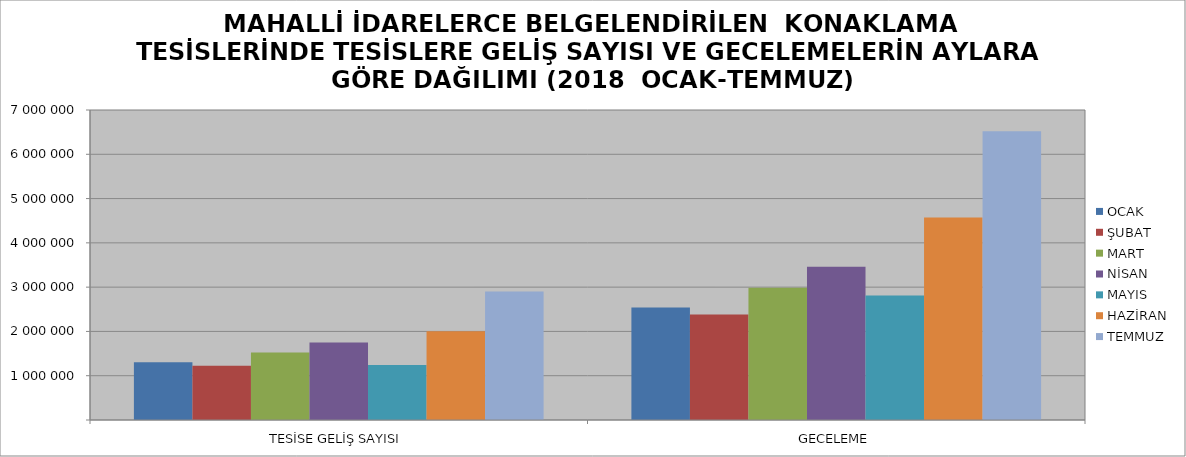
| Category | OCAK | ŞUBAT | MART | NİSAN | MAYIS | HAZİRAN | TEMMUZ |
|---|---|---|---|---|---|---|---|
| TESİSE GELİŞ SAYISI | 1303353 | 1223475 | 1526172 | 1749085 | 1240889 | 2003881 | 2904028 |
| GECELEME | 2542103 | 2381300 | 2986820 | 3463261 | 2810808 | 4572629 | 6517690 |